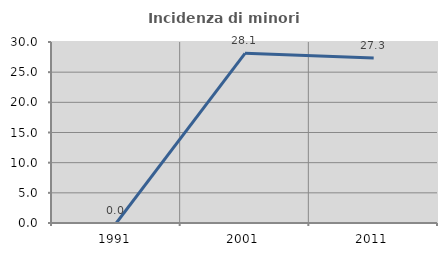
| Category | Incidenza di minori stranieri |
|---|---|
| 1991.0 | 0 |
| 2001.0 | 28.125 |
| 2011.0 | 27.344 |